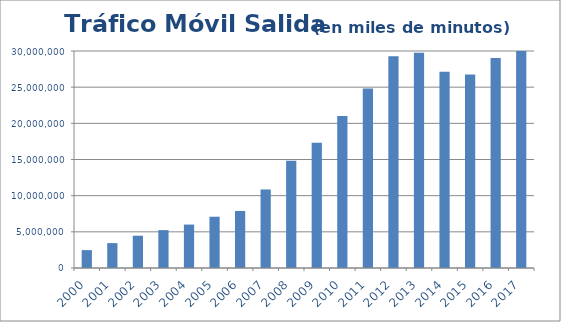
| Category | Tráfico Salida  en miles de minutos  |
|---|---|
| 2000 | 2471208.216 |
| 2001 | 3441736.145 |
| 2002 | 4464101.558 |
| 2003 | 5237945.688 |
| 2004 | 6003889.136 |
| 2005 | 7089121.671 |
| 2006 | 7881070.445 |
| 2007 | 10857829.097 |
| 2008 | 14842544.992 |
| 2009 | 17315937.37 |
| 2010 | 21012307.587 |
| 2011 | 24832335.384 |
| 2012 | 29284513.139 |
| 2013 | 29748487.795 |
| 2014 | 27120732.321 |
| 2015 | 26759882.276 |
| 2016 | 29023085.247 |
| 2017 | 30893589.798 |